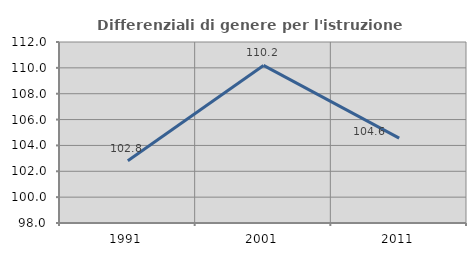
| Category | Differenziali di genere per l'istruzione superiore |
|---|---|
| 1991.0 | 102.808 |
| 2001.0 | 110.19 |
| 2011.0 | 104.567 |